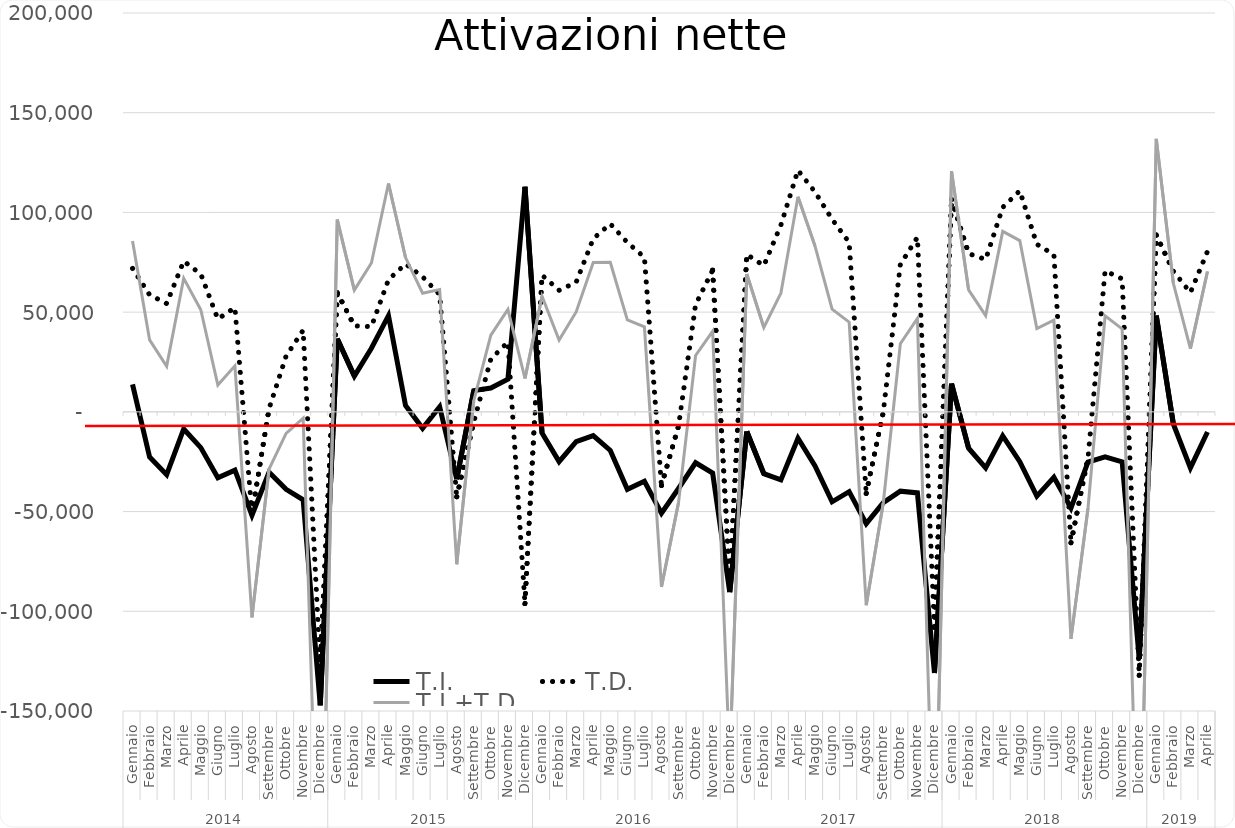
| Category | T.I. | T.D. | T.I.+T.D. |
|---|---|---|---|
| 0 | 13801 | 71906 | 85707 |
| 1 | -22614 | 58688 | 36074 |
| 2 | -31506 | 54316 | 22810 |
| 3 | -8593 | 75559 | 66966 |
| 4 | -17931 | 69132 | 51201 |
| 5 | -33079 | 46555 | 13476 |
| 6 | -29219 | 52282 | 23063 |
| 7 | -51907 | -51155 | -103062 |
| 8 | -30231 | 1531 | -28700 |
| 9 | -38837 | 28010 | -10827 |
| 10 | -44103 | 40921 | -3182 |
| 11 | -147156 | -127590 | -274746 |
| 12 | 36671 | 59709 | 96380 |
| 13 | 17937 | 43117 | 61054 |
| 14 | 31926 | 42744 | 74670 |
| 15 | 48245 | 66257 | 114502 |
| 16 | 3178 | 74197 | 77375 |
| 17 | -8238 | 67729 | 59491 |
| 18 | 2562 | 58803 | 61365 |
| 19 | -33811 | -42589 | -76400 |
| 20 | 10661 | -5082 | 5579 |
| 21 | 11939 | 26479 | 38418 |
| 22 | 16373 | 34994 | 51367 |
| 23 | 112884 | -96135 | 16749 |
| 24 | -10591 | 68560 | 57969 |
| 25 | -24945 | 60969 | 36024 |
| 26 | -14888 | 64990 | 50102 |
| 27 | -11876 | 86794 | 74918 |
| 28 | -19344 | 94298 | 74954 |
| 29 | -38851 | 84934 | 46083 |
| 30 | -34848 | 77509 | 42661 |
| 31 | -50828 | -36934 | -87762 |
| 32 | -38410 | -7100 | -45510 |
| 33 | -25518 | 53792 | 28274 |
| 34 | -30675 | 71061 | 40386 |
| 35 | -90391 | -84749 | -175140 |
| 36 | -9821 | 78947 | 69126 |
| 37 | -31006 | 73302 | 42296 |
| 38 | -34117 | 93657 | 59540 |
| 39 | -13254 | 121137 | 107883 |
| 40 | -27143 | 110260 | 83117 |
| 41 | -45103 | 96586 | 51483 |
| 42 | -40010 | 84990 | 44980 |
| 43 | -56048 | -40904 | -96952 |
| 44 | -45530 | -136 | -45666 |
| 45 | -39771 | 73922 | 34151 |
| 46 | -40637 | 87505 | 46868 |
| 47 | -130950 | -108020 | -238970 |
| 48 | 14141 | 106463 | 120604 |
| 49 | -18232 | 79393 | 61161 |
| 50 | -28128 | 76387 | 48259 |
| 51 | -12037 | 102530 | 90493 |
| 52 | -24984 | 110874 | 85890 |
| 53 | -42232 | 84026 | 41794 |
| 54 | -32826 | 78853 | 46027 |
| 55 | -48238 | -65618 | -113856 |
| 56 | -25141 | -23043 | -48184 |
| 57 | -22615 | 70716 | 48101 |
| 58 | -25076 | 66679 | 41603 |
| 59 | -123888 | -132091 | -255979 |
| 60 | 48258 | 88637 | 136895 |
| 61 | -6086 | 70565 | 64479 |
| 62 | -28093 | 59780 | 31687 |
| 63 | -10081 | 80439 | 70358 |